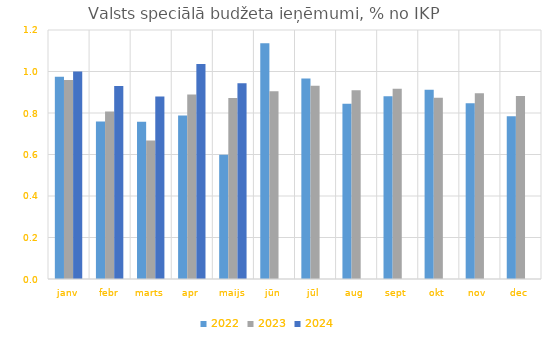
| Category | 2022 | 2023 | 2024 |
|---|---|---|---|
| janv | 0.974 | 0.959 | 1 |
| febr | 0.759 | 0.807 | 0.931 |
| marts | 0.758 | 0.668 | 0.88 |
| apr | 0.788 | 0.889 | 1.037 |
| maijs | 0.599 | 0.872 | 0.944 |
| jūn | 1.136 | 0.905 | 0 |
| jūl | 0.966 | 0.931 | 0 |
| aug | 0.845 | 0.909 | 0 |
| sept | 0.88 | 0.917 | 0 |
| okt | 0.912 | 0.874 | 0 |
| nov | 0.847 | 0.895 | 0 |
| dec | 0.784 | 0.882 | 0 |